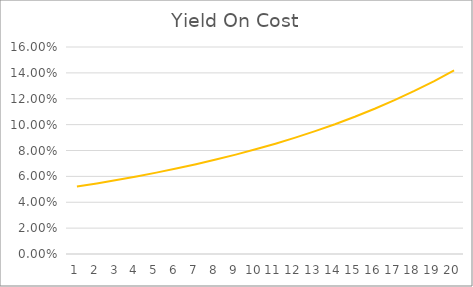
| Category | Yield On Cost |
|---|---|
| 1.0 | 0.052 |
| 2.0 | 0.055 |
| 3.0 | 0.057 |
| 4.0 | 0.06 |
| 5.0 | 0.063 |
| 6.0 | 0.066 |
| 7.0 | 0.069 |
| 8.0 | 0.073 |
| 9.0 | 0.077 |
| 10.0 | 0.081 |
| 11.0 | 0.085 |
| 12.0 | 0.09 |
| 13.0 | 0.095 |
| 14.0 | 0.1 |
| 15.0 | 0.106 |
| 16.0 | 0.112 |
| 17.0 | 0.119 |
| 18.0 | 0.126 |
| 19.0 | 0.134 |
| 20.0 | 0.142 |